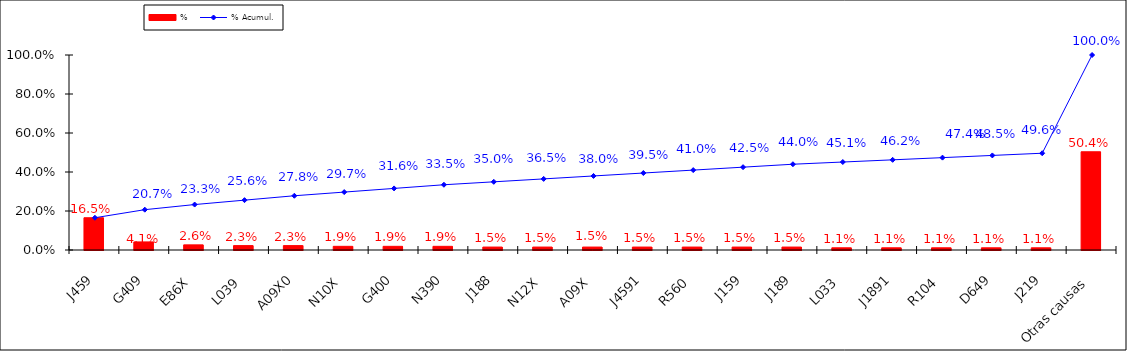
| Category | % |
|---|---|
| J459 | 0.165 |
| G409 | 0.041 |
| E86X | 0.026 |
| L039 | 0.023 |
| A09X0 | 0.023 |
| N10X | 0.019 |
| G400 | 0.019 |
| N390 | 0.019 |
| J188 | 0.015 |
| N12X | 0.015 |
| A09X | 0.015 |
| J4591 | 0.015 |
| R560 | 0.015 |
| J159 | 0.015 |
| J189 | 0.015 |
| L033 | 0.011 |
| J1891 | 0.011 |
| R104 | 0.011 |
| D649 | 0.011 |
| J219 | 0.011 |
| Otras causas | 0.504 |